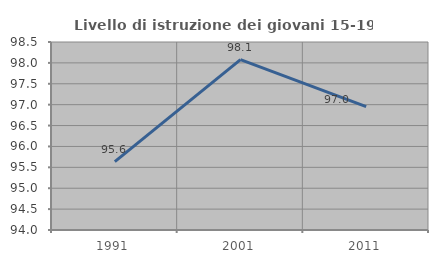
| Category | Livello di istruzione dei giovani 15-19 anni |
|---|---|
| 1991.0 | 95.635 |
| 2001.0 | 98.077 |
| 2011.0 | 96.954 |